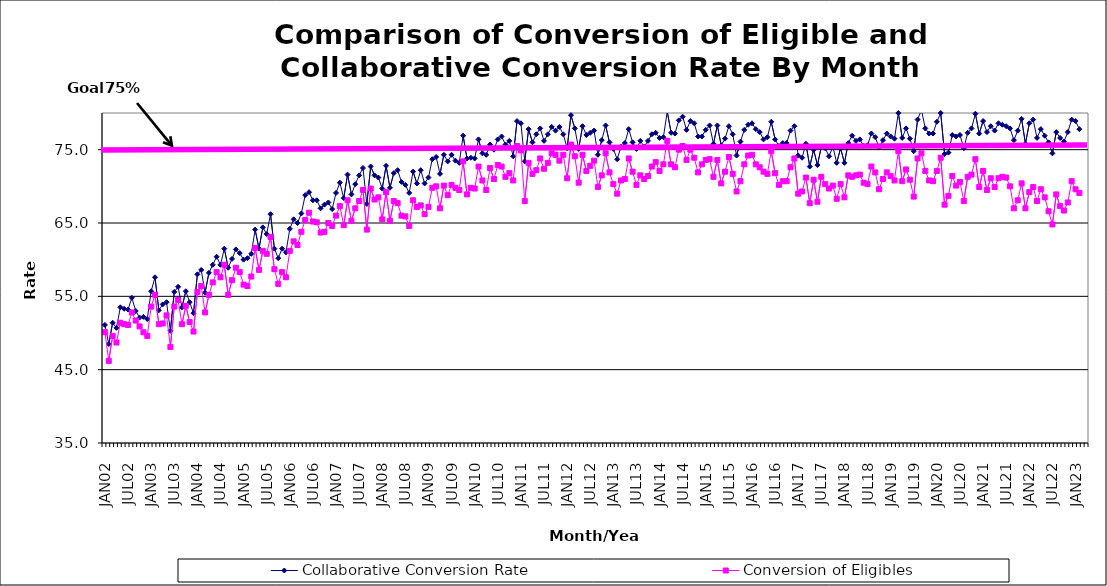
| Category | Collaborative Conversion Rate | Conversion of Eligibles |
|---|---|---|
| JAN02 | 51.1 | 50.1 |
| FEB02 | 48.5 | 46.2 |
| MAR02 | 51.4 | 49.6 |
| APR02 | 50.7 | 48.7 |
| MAY02 | 53.5 | 51.4 |
| JUN02 | 53.3 | 51.2 |
| JUL02 | 53.2 | 51.1 |
| AUG02 | 54.8 | 52.8 |
| SEP02 | 53 | 51.7 |
| OCT02 | 52.1 | 50.9 |
| NOV02 | 52.2 | 50.1 |
| DEC02 | 51.9 | 49.6 |
| JAN03 | 55.7 | 53.6 |
| FEB03 | 57.6 | 55.2 |
| MAR03 | 53.1 | 51.2 |
| APR03 | 53.9 | 51.3 |
| MAY03 | 54.2 | 52.4 |
| JUN03 | 50.3 | 48.1 |
| JUL03 | 55.6 | 53.6 |
| AUG03 | 56.3 | 54.5 |
| SEP03 | 53.5 | 51.2 |
| OCT03 | 55.7 | 53.7 |
| NOV03 | 54.2 | 51.5 |
| DEC03 | 52.7 | 50.2 |
| JAN04 | 58 | 55.6 |
| FEB04 | 58.6 | 56.4 |
| MAR04 | 55.5 | 52.8 |
| APR04 | 58.2 | 55.2 |
| MAY04 | 59.3 | 56.9 |
| JUN04 | 60.4 | 58.3 |
| JUL04 | 59.3 | 57.6 |
| AUG04 | 61.5 | 59.3 |
| SEP04 | 58.9 | 55.2 |
| OCT04 | 60.1 | 57.2 |
| NOV04 | 61.4 | 58.9 |
| DEC04 | 60.9 | 58.3 |
| JAN05 | 60 | 56.6 |
| FEB05 | 60.2 | 56.4 |
| MAR05 | 60.8 | 57.7 |
| APR05 | 64.1 | 61.6 |
| MAY05 | 61.5 | 58.6 |
| JUN05 | 64.4 | 61.2 |
| JUL05 | 63.5 | 60.8 |
| AUG05 | 66.2 | 63.1 |
| SEP05 | 61.5 | 58.7 |
| OCT05 | 60.2 | 56.7 |
| NOV05 | 61.5 | 58.3 |
| DEC05 | 61 | 57.6 |
| JAN06 | 64.2 | 61.2 |
| FEB06 | 65.5 | 62.5 |
| MAR06 | 65 | 62 |
| APR06 | 66.3 | 63.8 |
| MAY06 | 68.8 | 65.4 |
| JUN06 | 69.2 | 66.4 |
| JUL06 | 68.1 | 65.2 |
| AUG06 | 68.1 | 65.1 |
| SEP06 | 67 | 63.7 |
| OCT06 | 67.5 | 63.8 |
| NOV06 | 67.8 | 65 |
| DEC06 | 66.9 | 64.6 |
| JAN07 | 69.1 | 66 |
| FEB07 | 70.5 | 67.3 |
| MAR07 | 68.4 | 64.7 |
| APR07 | 71.6 | 68.1 |
| MAY07 | 68.9 | 65.3 |
| JUN07 | 70.3 | 67 |
| JUL07 | 71.5 | 68 |
| AUG07 | 72.5 | 69.5 |
| SEP07 | 67.6 | 64.1 |
| OCT07 | 72.7 | 69.7 |
| NOV07 | 71.5 | 68.2 |
| DEC07 | 71.2 | 68.5 |
| JAN08 | 69.7 | 65.5 |
| FEB08 | 72.8 | 69.2 |
| MAR08 | 69.8 | 65.3 |
| APR08 | 71.8 | 68 |
| MAY08 | 72.2 | 67.7 |
| JUN08 | 70.6 | 66 |
| JUL08 | 70.2 | 65.9 |
| AUG08 | 69.1 | 64.6 |
| SEP08 | 72 | 68.1 |
| OCT08 | 70.4 | 67.2 |
| NOV08 | 72.2 | 67.4 |
| DEC08 | 70.4 | 66.2 |
| JAN09 | 71.2 | 67.2 |
| FEB09 | 73.7 | 69.8 |
| MAR09 | 74 | 70 |
| APR09 | 71.7 | 67 |
| MAY09 | 74.3 | 70.1 |
| JUN09 | 73.4 | 68.8 |
| JUL09 | 74.3 | 70.2 |
| AUG09 | 73.5 | 69.8 |
| SEP09 | 73.2 | 69.5 |
| OCT09 | 76.9 | 73.4 |
| NOV09 | 73.8 | 68.9 |
| DEC09 | 73.9 | 69.8 |
| JAN10 | 73.8 | 69.7 |
| FEB10 | 76.4 | 72.7 |
| MAR10 | 74.5 | 70.8 |
| APR10 | 74.3 | 69.5 |
| MAY10 | 75.7 | 72.5 |
| JUN10 | 75 | 71 |
| JUL10 | 76.4 | 72.9 |
| AUG10 | 76.8 | 72.7 |
| SEP10 | 75.7 | 71.3 |
| OCT10 | 76.2 | 71.8 |
| NOV10 | 74.1 | 70.8 |
| DEC10 | 78.9 | 75.5 |
| JAN11 | 78.6 | 74.9 |
| FEB11 | 73.4 | 68 |
| MAR11 | 77.8 | 73.2 |
| APR11 | 76 | 71.7 |
| MAY11 | 77.1 | 72.2 |
| JUN11 | 77.9 | 73.8 |
| JUL11 | 76.2 | 72.4 |
| AUG11 | 77.1 | 73.2 |
| SEP11 | 78.1 | 74.5 |
| OCT11 | 77.6 | 74.3 |
| NOV11 | 78.1 | 73.5 |
| DEC11 | 77.1 | 74.3 |
| JAN12 | 75.2 | 71.1 |
| FEB12 | 79.7 | 75.7 |
| MAR12 | 77.9 | 74.1 |
| APR12 | 75.1 | 70.5 |
| MAY12 | 78.2 | 74.3 |
| JUN12 | 77 | 72.1 |
| JUL12 | 77.3 | 72.8 |
| AUG12 | 77.6 | 73.5 |
| SEP12 | 74.3 | 69.9 |
| OCT12 | 76.3 | 71.5 |
| NOV12 | 78.3 | 74.5 |
| DEC12 | 76 | 71.9 |
| JAN13 | 75.1 | 70.3 |
| FEB13 | 73.7 | 69 |
| MAR13 | 75.4 | 70.8 |
| APR13 | 75.9 | 71 |
| MAY13 | 77.8 | 73.8 |
| JUN13 | 76 | 72 |
| JUL13 | 75.1 | 70.2 |
| AUG13 | 76.2 | 71.5 |
| SEP13 | 75.4 | 71 |
| OCT13 | 76.2 | 71.4 |
| NOV13 | 77.1 | 72.7 |
| DEC13 | 77.3 | 73.3 |
| JAN14 | 76.6 | 72.1 |
| FEB14 | 76.7 | 73 |
| MAR14 | 80.2 | 76.2 |
| APR14 | 77.3 | 73 |
| MAY14 | 77.2 | 72.6 |
| JUN14 | 79 | 75 |
| JUL14 | 79.5 | 75.5 |
| AUG14 | 77.7 | 73.6 |
| SEP14 | 78.9 | 75 |
| OCT14 | 78.6 | 73.9 |
| NOV14 | 76.8 | 71.9 |
| DEC14 | 76.8 | 73 |
| JAN15 | 77.7 | 73.6 |
| FEB15 | 78.3 | 73.7 |
| MAR15 | 75.8 | 71.3 |
| APR15 | 78.3 | 73.6 |
| MAY15 | 75.6 | 70.4 |
| JUN15 | 76.5 | 72 |
| JUL15 | 78.2 | 74 |
| AUG15 | 77.1 | 71.7 |
| SEP15 | 74.2 | 69.3 |
| OCT15 | 76.1 | 70.7 |
| NOV15 | 77.7 | 73 |
| DEC15 | 78.4 | 74.2 |
| JAN16 | 78.6 | 74.3 |
| FEB16 | 77.8 | 73 |
| MAR16 | 77.4 | 72.6 |
| APR16 | 76.4 | 72 |
| MAY16 | 76.7 | 71.7 |
| JUN16 | 78.8 | 74.8 |
| JUL16 | 76.4 | 71.8 |
| AUG16 | 75.5 | 70.2 |
| SEP16 | 75.9 | 70.7 |
| OCT16 | 75.9 | 70.7 |
| NOV16 | 77.6 | 72.6 |
| DEC16 | 78.2 | 73.8 |
| JAN17 | 74.2 | 69 |
| FEB17 | 73.9 | 69.3 |
| MAR17 | 75.8 | 71.2 |
| APR17 | 72.7 | 67.7 |
| MAY17 | 75 | 70.9 |
| JUN17 | 72.9 | 67.9 |
| JUL17 | 75.4 | 71.3 |
| AUG17 | 75.2 | 70.3 |
| SEP17 | 74.1 | 69.7 |
| OCT17 | 75.4 | 70.1 |
| NOV17 | 73.2 | 68.3 |
| DEC17 | 75.2 | 70.3 |
| JAN18 | 73.2 | 68.5 |
| FEB18 | 75.9 | 71.5 |
| MAR18 | 76.9 | 71.3 |
| APR18 | 76.2 | 71.5 |
| MAY18 | 76.4 | 71.6 |
| JUN18 | 75.5 | 70.5 |
| JUL18 | 75.6 | 70.3 |
| AUG18 | 77.2 | 72.7 |
| SEP18 | 76.7 | 71.9 |
| OCT18 | 75.3 | 69.6 |
| NOV18 | 76.3 | 71 |
| DEC18 | 77.2 | 71.9 |
| JAN19 | 76.8 | 71.4 |
| FEB19 | 76.5 | 70.8 |
| MAR19 | 80 | 74.8 |
| APR19 | 76.6 | 70.7 |
| MAY19 | 77.9 | 72.3 |
| JUN19 | 76.5 | 70.9 |
| JUL19 | 74.8 | 68.6 |
| AUG19 | 79.1 | 73.8 |
| SEP19 | 80.4 | 74.5 |
| OCT19 | 77.9 | 72.1 |
| NOV19 | 77.2 | 70.8 |
| DEC19 | 77.2 | 70.7 |
| JAN20 | 78.8 | 72.1 |
| FEB20 | 80 | 73.9 |
| MAR20 | 74.4 | 67.5 |
| APR20 | 74.6 | 68.7 |
| MAY20 | 77 | 71.4 |
| JUN20 | 76.8 | 70.1 |
| JUL20 | 77 | 70.6 |
| AUG20 | 75.2 | 68 |
| SEP20 | 77.3 | 71.3 |
| OCT20 | 77.9 | 71.6 |
| NOV20 | 79.9 | 73.7 |
| DEC20 | 77.2 | 69.9 |
| JAN21 | 78.9 | 72.1 |
| FEB21 | 77.4 | 69.5 |
| MAR21 | 78.2 | 71.1 |
| APR21 | 77.6 | 69.9 |
| MAY21 | 78.6 | 71.1 |
| JUN21 | 78.4 | 71.3 |
| JUL21 | 78.2 | 71.2 |
| AUG21 | 77.9 | 70 |
| SEP21 | 76.3 | 67 |
| OCT21 | 77.6 | 68.1 |
| NOV21 | 79.2 | 70.4 |
| DEC21 | 75.8 | 67 |
| JAN22 | 78.6 | 69.2 |
| FEB22 | 79.1 | 69.9 |
| MAR22 | 76.6 | 68 |
| APR22 | 77.8 | 69.6 |
| MAY22 | 76.9 | 68.5 |
| JUN22 | 76 | 66.6 |
| JUL22 | 74.5 | 64.8 |
| AUG22 | 77.4 | 68.9 |
| SEP22 | 76.6 | 67.3 |
| OCT22 | 76.1 | 66.7 |
| NOV22 | 77.4 | 67.8 |
| DEC22 | 79.1 | 70.7 |
| JAN23 | 78.9 | 69.6 |
| FEB23 | 77.8 | 69.1 |